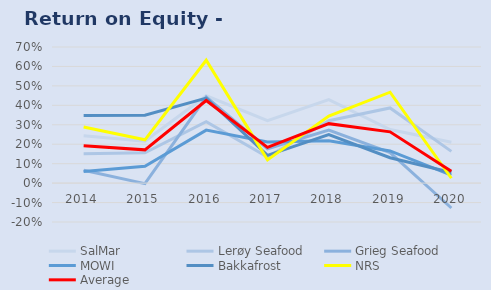
| Category | SalMar | Lerøy Seafood | Grieg Seafood | MOWI | Bakkafrost | NRS | Average |
|---|---|---|---|---|---|---|---|
| 2014.0 | 0.243 | 0.151 | 0.066 | 0.06 | 0.347 | 0.288 | 0.193 |
| 2015.0 | 0.216 | 0.156 | -0.003 | 0.086 | 0.349 | 0.223 | 0.171 |
| 2016.0 | 0.449 | 0.316 | 0.443 | 0.273 | 0.437 | 0.632 | 0.425 |
| 2017.0 | 0.321 | 0.134 | 0.177 | 0.211 | 0.142 | 0.119 | 0.184 |
| 2018.0 | 0.429 | 0.321 | 0.272 | 0.218 | 0.249 | 0.345 | 0.306 |
| 2019.0 | 0.276 | 0.386 | 0.156 | 0.166 | 0.131 | 0.468 | 0.264 |
| 2020.0 | 0.21 | 0.163 | -0.128 | 0.042 | 0.054 | 0.025 | 0.061 |